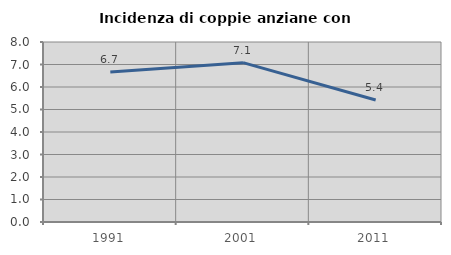
| Category | Incidenza di coppie anziane con figli |
|---|---|
| 1991.0 | 6.667 |
| 2001.0 | 7.082 |
| 2011.0 | 5.422 |